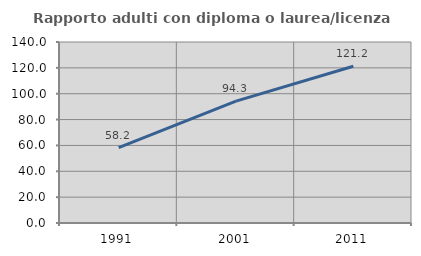
| Category | Rapporto adulti con diploma o laurea/licenza media  |
|---|---|
| 1991.0 | 58.234 |
| 2001.0 | 94.253 |
| 2011.0 | 121.205 |